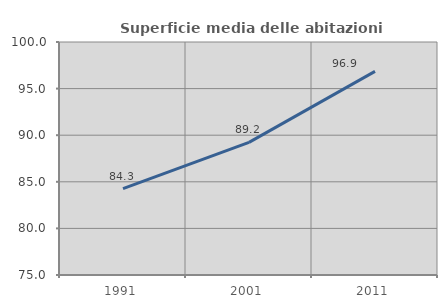
| Category | Superficie media delle abitazioni occupate |
|---|---|
| 1991.0 | 84.263 |
| 2001.0 | 89.227 |
| 2011.0 | 96.85 |